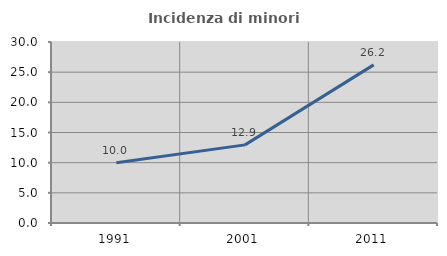
| Category | Incidenza di minori stranieri |
|---|---|
| 1991.0 | 10 |
| 2001.0 | 12.95 |
| 2011.0 | 26.21 |